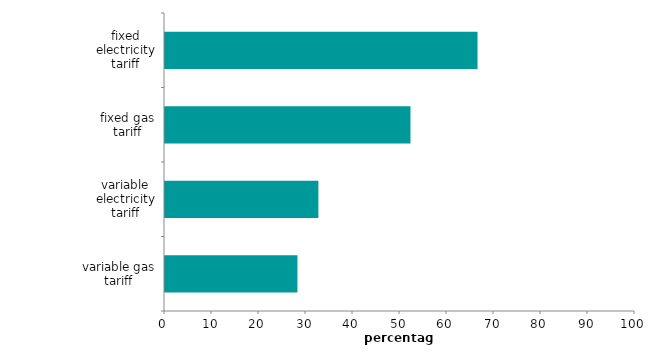
| Category | Series 0 |
|---|---|
| variable gas tariff | 28.177 |
| variable electricity tariff | 32.637 |
| fixed gas tariff | 52.227 |
| fixed electricity tariff | 66.496 |